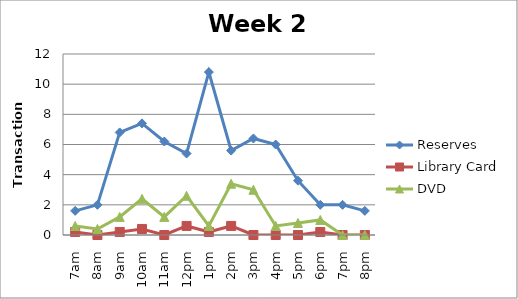
| Category | Reserves | Library Card | DVD |
|---|---|---|---|
| 7am | 1.6 | 0.2 | 0.6 |
| 8am | 2 | 0 | 0.4 |
| 9am | 6.8 | 0.2 | 1.2 |
| 10am | 7.4 | 0.4 | 2.4 |
| 11am | 6.2 | 0 | 1.2 |
| 12pm | 5.4 | 0.6 | 2.6 |
| 1pm | 10.8 | 0.2 | 0.6 |
| 2pm | 5.6 | 0.6 | 3.4 |
| 3pm | 6.4 | 0 | 3 |
| 4pm | 6 | 0 | 0.6 |
| 5pm | 3.6 | 0 | 0.8 |
| 6pm | 2 | 0.2 | 1 |
| 7pm | 2 | 0 | 0 |
| 8pm | 1.6 | 0 | 0 |